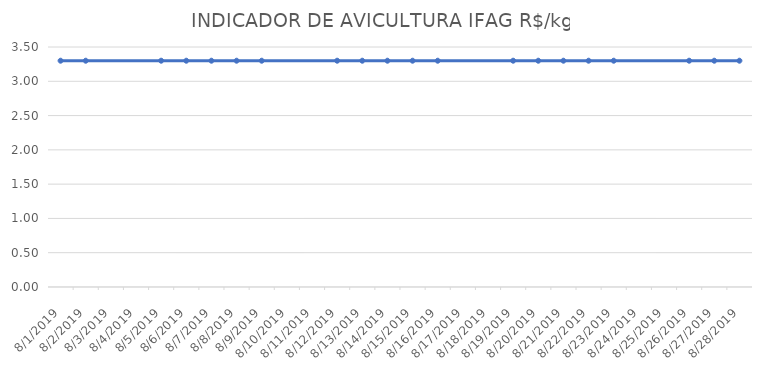
| Category | INDICADOR DE AVICULTURA IFAG |
|---|---|
| 8/1/19 | 3.3 |
| 8/2/19 | 3.3 |
| 8/5/19 | 3.3 |
| 8/6/19 | 3.3 |
| 8/7/19 | 3.3 |
| 8/8/19 | 3.3 |
| 8/9/19 | 3.3 |
| 8/12/19 | 3.3 |
| 8/13/19 | 3.3 |
| 8/14/19 | 3.3 |
| 8/15/19 | 3.3 |
| 8/16/19 | 3.3 |
| 8/19/19 | 3.3 |
| 8/20/19 | 3.3 |
| 8/21/19 | 3.3 |
| 8/22/19 | 3.3 |
| 8/23/19 | 3.3 |
| 8/26/19 | 3.3 |
| 8/27/19 | 3.3 |
| 8/28/19 | 3.3 |